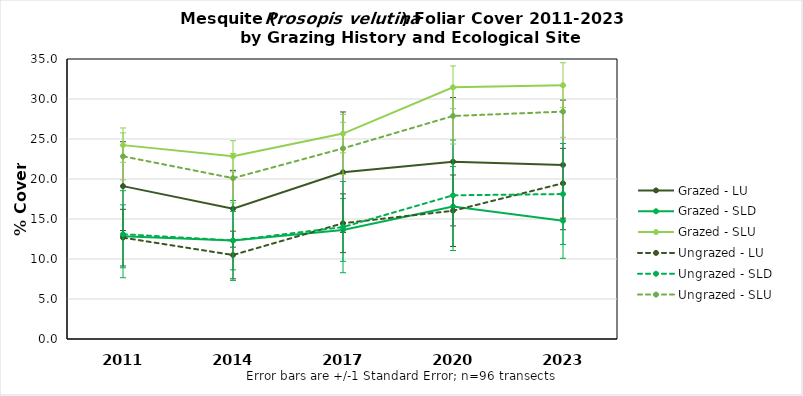
| Category | Grazed - LU | Grazed - SLD | Grazed - SLU | Ungrazed - LU | Ungrazed - SLD | Ungrazed - SLU |
|---|---|---|---|---|---|---|
| 2011.0 | 19.11 | 12.84 | 24.235 | 12.67 | 13.1 | 22.835 |
| 2014.0 | 16.28 | 12.3 | 22.846 | 10.5 | 12.32 | 20.106 |
| 2017.0 | 20.85 | 13.63 | 25.675 | 14.47 | 13.99 | 23.827 |
| 2020.0 | 22.16 | 16.56 | 31.463 | 16.03 | 17.96 | 27.879 |
| 2023.0 | 21.76 | 14.77 | 31.727 | 19.47 | 18.12 | 28.421 |